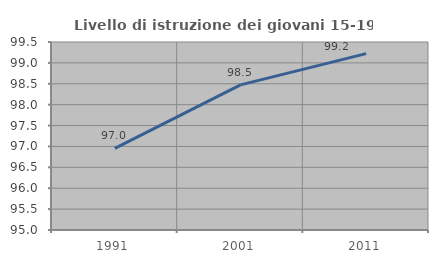
| Category | Livello di istruzione dei giovani 15-19 anni |
|---|---|
| 1991.0 | 96.953 |
| 2001.0 | 98.474 |
| 2011.0 | 99.223 |